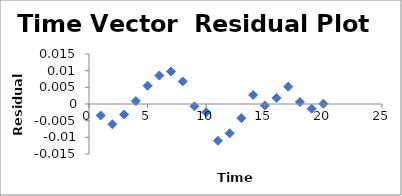
| Category | Series 0 |
|---|---|
| 1.0 | -0.003 |
| 2.0 | -0.006 |
| 3.0 | -0.003 |
| 4.0 | 0.001 |
| 5.0 | 0.005 |
| 6.0 | 0.009 |
| 7.0 | 0.01 |
| 8.0 | 0.007 |
| 9.0 | -0.001 |
| 10.0 | -0.002 |
| 11.0 | -0.011 |
| 12.0 | -0.009 |
| 13.0 | -0.004 |
| 14.0 | 0.003 |
| 15.0 | 0 |
| 16.0 | 0.002 |
| 17.0 | 0.005 |
| 18.0 | 0.001 |
| 19.0 | -0.001 |
| 20.0 | 0 |